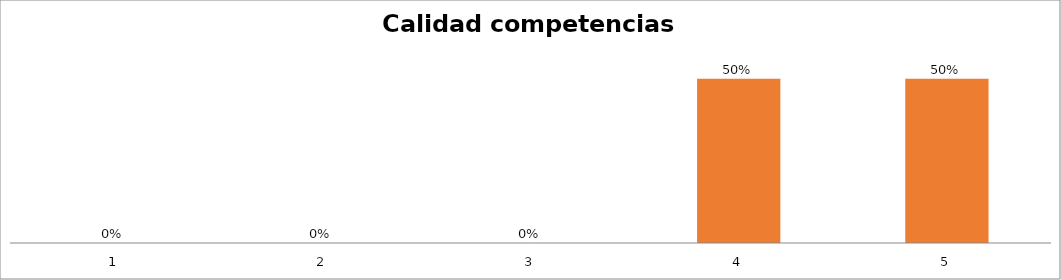
| Category | Series 1 |
|---|---|
| 0 | 0 |
| 1 | 0 |
| 2 | 0 |
| 3 | 0.5 |
| 4 | 0.5 |